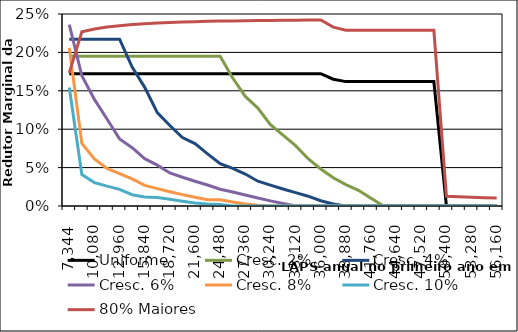
| Category | Uniforme | Cresc. 2% | Cresc. 4% | Cresc. 6% | Cresc. 8% | Cresc. 10% | 80% Maiores |
|---|---|---|---|---|---|---|---|
| 7344.0 | 0.172 | 0.195 | 0.217 | 0.236 | 0.206 | 0.154 | 0.173 |
| 8640.0 | 0.172 | 0.195 | 0.217 | 0.17 | 0.082 | 0.041 | 0.227 |
| 10080.0 | 0.172 | 0.195 | 0.217 | 0.139 | 0.061 | 0.03 | 0.23 |
| 11520.0 | 0.172 | 0.195 | 0.217 | 0.113 | 0.049 | 0.026 | 0.233 |
| 12960.0 | 0.172 | 0.195 | 0.217 | 0.087 | 0.042 | 0.022 | 0.235 |
| 14400.0 | 0.172 | 0.195 | 0.181 | 0.076 | 0.035 | 0.015 | 0.236 |
| 15840.0 | 0.172 | 0.195 | 0.155 | 0.062 | 0.027 | 0.012 | 0.237 |
| 17280.0 | 0.172 | 0.195 | 0.122 | 0.053 | 0.023 | 0.011 | 0.238 |
| 18720.0 | 0.172 | 0.195 | 0.105 | 0.043 | 0.019 | 0.009 | 0.239 |
| 20160.0 | 0.172 | 0.195 | 0.089 | 0.037 | 0.015 | 0.006 | 0.24 |
| 21600.0 | 0.172 | 0.195 | 0.081 | 0.032 | 0.011 | 0.004 | 0.24 |
| 23040.0 | 0.172 | 0.195 | 0.068 | 0.027 | 0.008 | 0.003 | 0.24 |
| 24480.0 | 0.172 | 0.195 | 0.055 | 0.022 | 0.008 | 0.002 | 0.241 |
| 25920.0 | 0.172 | 0.167 | 0.049 | 0.018 | 0.005 | 0 | 0.241 |
| 27360.0 | 0.172 | 0.143 | 0.042 | 0.014 | 0.003 | 0 | 0.241 |
| 28800.0 | 0.172 | 0.128 | 0.032 | 0.01 | 0.001 | 0 | 0.242 |
| 30240.0 | 0.172 | 0.106 | 0.027 | 0.007 | 0 | 0 | 0.242 |
| 31680.0 | 0.172 | 0.092 | 0.022 | 0.003 | 0 | 0 | 0.242 |
| 33120.0 | 0.172 | 0.079 | 0.017 | 0 | 0 | 0 | 0.242 |
| 34560.0 | 0.172 | 0.062 | 0.013 | 0 | 0 | 0 | 0.242 |
| 36000.0 | 0.172 | 0.048 | 0.007 | 0 | 0 | 0 | 0.242 |
| 37440.0 | 0.165 | 0.037 | 0.003 | 0 | 0 | 0 | 0.233 |
| 38880.0 | 0.162 | 0.028 | 0 | 0 | 0 | 0 | 0.229 |
| 40320.0 | 0.162 | 0.02 | 0 | 0 | 0 | 0 | 0.229 |
| 41760.0 | 0.162 | 0.01 | 0 | 0 | 0 | 0 | 0.229 |
| 43200.0 | 0.162 | 0 | 0 | 0 | 0 | 0 | 0.229 |
| 44640.0 | 0.162 | 0 | 0 | 0 | 0 | 0 | 0.229 |
| 46080.0 | 0.162 | 0 | 0 | 0 | 0 | 0 | 0.229 |
| 47520.0 | 0.162 | 0 | 0 | 0 | 0 | 0 | 0.229 |
| 48960.0 | 0.162 | 0 | 0 | 0 | 0 | 0 | 0.229 |
| 50400.0 | 0 | 0 | 0 | 0 | 0 | 0 | 0.013 |
| 51840.0 | 0 | 0 | 0 | 0 | 0 | 0 | 0.012 |
| 53280.0 | 0 | 0 | 0 | 0 | 0 | 0 | 0.011 |
| 54720.0 | 0 | 0 | 0 | 0 | 0 | 0 | 0.011 |
| 56160.0 | 0 | 0 | 0 | 0 | 0 | 0 | 0.01 |